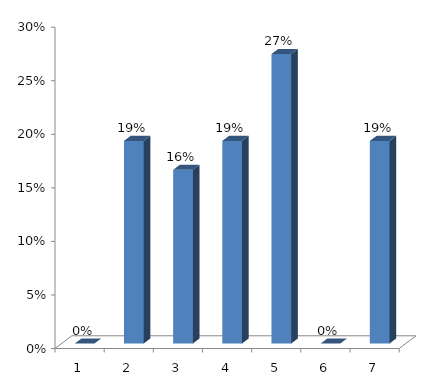
| Category | Series 0 |
|---|---|
| 0 | 0 |
| 1 | 0.189 |
| 2 | 0.162 |
| 3 | 0.189 |
| 4 | 0.27 |
| 5 | 0 |
| 6 | 0.189 |